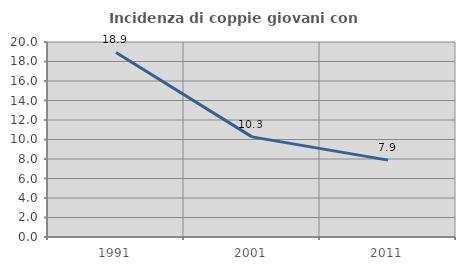
| Category | Incidenza di coppie giovani con figli |
|---|---|
| 1991.0 | 18.923 |
| 2001.0 | 10.27 |
| 2011.0 | 7.886 |